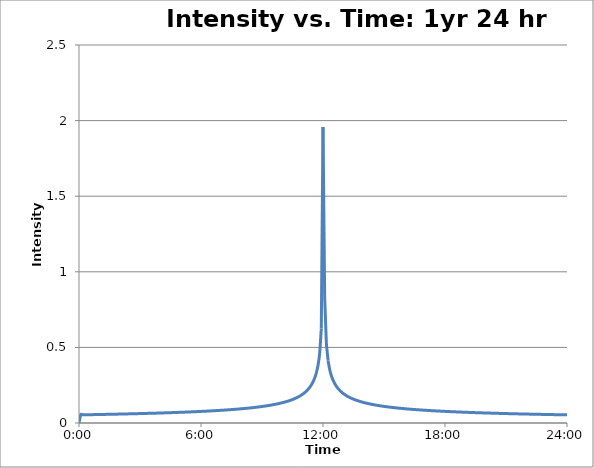
| Category | HCE (CAP) Design Storms |
|---|---|
| 0.0 | 0 |
| 0.003472222222222222 | 0.054 |
| 0.006944444444444444 | 0.054 |
| 0.0104166666666667 | 0.054 |
| 0.0138888888888889 | 0.054 |
| 0.0173611111111111 | 0.055 |
| 0.0208333333333333 | 0.055 |
| 0.0243055555555556 | 0.055 |
| 0.0277777777777778 | 0.055 |
| 0.03125 | 0.056 |
| 0.0347222222222222 | 0.056 |
| 0.0381944444444444 | 0.056 |
| 0.0416666666666667 | 0.056 |
| 0.0451388888888889 | 0.056 |
| 0.0486111111111111 | 0.057 |
| 0.0520833333333333 | 0.057 |
| 0.0555555555555556 | 0.057 |
| 0.0590277777777778 | 0.057 |
| 0.0625 | 0.058 |
| 0.0659722222222222 | 0.058 |
| 0.0694444444444444 | 0.058 |
| 0.0729166666666667 | 0.058 |
| 0.0763888888888889 | 0.058 |
| 0.0798611111111111 | 0.059 |
| 0.0833333333333333 | 0.059 |
| 0.0868055555555556 | 0.059 |
| 0.0902777777777778 | 0.06 |
| 0.09375 | 0.06 |
| 0.0972222222222222 | 0.06 |
| 0.100694444444444 | 0.06 |
| 0.104166666666667 | 0.061 |
| 0.107638888888889 | 0.061 |
| 0.111111111111111 | 0.061 |
| 0.114583333333333 | 0.061 |
| 0.118055555555556 | 0.062 |
| 0.121527777777778 | 0.062 |
| 0.125 | 0.062 |
| 0.128472222222222 | 0.063 |
| 0.131944444444444 | 0.063 |
| 0.135416666666667 | 0.063 |
| 0.138888888888889 | 0.064 |
| 0.142361111111111 | 0.064 |
| 0.145833333333333 | 0.064 |
| 0.149305555555556 | 0.064 |
| 0.152777777777778 | 0.065 |
| 0.15625 | 0.065 |
| 0.159722222222222 | 0.065 |
| 0.163194444444444 | 0.066 |
| 0.166666666666667 | 0.066 |
| 0.170138888888889 | 0.066 |
| 0.173611111111111 | 0.067 |
| 0.177083333333333 | 0.067 |
| 0.180555555555556 | 0.068 |
| 0.184027777777778 | 0.068 |
| 0.1875 | 0.068 |
| 0.190972222222222 | 0.069 |
| 0.194444444444444 | 0.069 |
| 0.197916666666667 | 0.07 |
| 0.201388888888889 | 0.07 |
| 0.204861111111111 | 0.07 |
| 0.208333333333333 | 0.071 |
| 0.211805555555556 | 0.071 |
| 0.215277777777778 | 0.072 |
| 0.21875 | 0.072 |
| 0.222222222222222 | 0.073 |
| 0.225694444444444 | 0.073 |
| 0.229166666666667 | 0.074 |
| 0.232638888888889 | 0.074 |
| 0.236111111111111 | 0.074 |
| 0.239583333333333 | 0.075 |
| 0.243055555555556 | 0.076 |
| 0.246527777777778 | 0.076 |
| 0.25 | 0.077 |
| 0.253472222222222 | 0.077 |
| 0.256944444444444 | 0.078 |
| 0.260416666666667 | 0.078 |
| 0.263888888888889 | 0.079 |
| 0.267361111111111 | 0.08 |
| 0.270833333333333 | 0.08 |
| 0.274305555555556 | 0.081 |
| 0.277777777777778 | 0.081 |
| 0.28125 | 0.082 |
| 0.284722222222222 | 0.083 |
| 0.288194444444444 | 0.083 |
| 0.291666666666667 | 0.084 |
| 0.295138888888889 | 0.085 |
| 0.298611111111111 | 0.086 |
| 0.302083333333333 | 0.086 |
| 0.305555555555556 | 0.087 |
| 0.309027777777778 | 0.088 |
| 0.3125 | 0.089 |
| 0.315972222222222 | 0.09 |
| 0.319444444444444 | 0.09 |
| 0.322916666666667 | 0.091 |
| 0.326388888888889 | 0.092 |
| 0.329861111111111 | 0.093 |
| 0.333333333333333 | 0.094 |
| 0.336805555555556 | 0.095 |
| 0.340277777777778 | 0.096 |
| 0.34375 | 0.097 |
| 0.347222222222222 | 0.098 |
| 0.350694444444444 | 0.1 |
| 0.354166666666667 | 0.101 |
| 0.357638888888889 | 0.102 |
| 0.361111111111111 | 0.103 |
| 0.364583333333333 | 0.105 |
| 0.368055555555556 | 0.106 |
| 0.371527777777778 | 0.108 |
| 0.375 | 0.109 |
| 0.378472222222222 | 0.111 |
| 0.381944444444444 | 0.112 |
| 0.385416666666667 | 0.114 |
| 0.388888888888889 | 0.116 |
| 0.392361111111111 | 0.118 |
| 0.395833333333333 | 0.12 |
| 0.399305555555556 | 0.122 |
| 0.402777777777778 | 0.124 |
| 0.40625 | 0.126 |
| 0.409722222222222 | 0.129 |
| 0.413194444444444 | 0.131 |
| 0.416666666666667 | 0.134 |
| 0.420138888888889 | 0.137 |
| 0.423611111111111 | 0.14 |
| 0.427083333333333 | 0.144 |
| 0.430555555555556 | 0.147 |
| 0.434027777777778 | 0.151 |
| 0.4375 | 0.155 |
| 0.440972222222222 | 0.16 |
| 0.444444444444444 | 0.165 |
| 0.447916666666667 | 0.17 |
| 0.451388888888889 | 0.176 |
| 0.454861111111111 | 0.183 |
| 0.458333333333333 | 0.191 |
| 0.461805555555556 | 0.199 |
| 0.465277777777778 | 0.209 |
| 0.46875 | 0.22 |
| 0.472222222222222 | 0.234 |
| 0.475694444444444 | 0.25 |
| 0.479166666666667 | 0.27 |
| 0.482638888888889 | 0.295 |
| 0.486111111111111 | 0.329 |
| 0.489583333333333 | 0.378 |
| 0.493055555555556 | 0.458 |
| 0.496527777777778 | 0.625 |
| 0.5 | 1.957 |
| 0.503472222222222 | 0.827 |
| 0.506944444444444 | 0.523 |
| 0.510416666666667 | 0.412 |
| 0.513888888888889 | 0.351 |
| 0.517361111111111 | 0.311 |
| 0.520833333333333 | 0.281 |
| 0.524305555555556 | 0.259 |
| 0.527777777777778 | 0.241 |
| 0.53125 | 0.227 |
| 0.534722222222222 | 0.214 |
| 0.538194444444444 | 0.204 |
| 0.541666666666667 | 0.195 |
| 0.545138888888889 | 0.187 |
| 0.548611111111111 | 0.18 |
| 0.552083333333333 | 0.173 |
| 0.555555555555556 | 0.168 |
| 0.559027777777778 | 0.162 |
| 0.5625 | 0.158 |
| 0.565972222222222 | 0.153 |
| 0.569444444444444 | 0.149 |
| 0.572916666666667 | 0.145 |
| 0.576388888888889 | 0.142 |
| 0.579861111111111 | 0.139 |
| 0.583333333333333 | 0.136 |
| 0.586805555555555 | 0.133 |
| 0.590277777777778 | 0.13 |
| 0.59375 | 0.128 |
| 0.597222222222222 | 0.125 |
| 0.600694444444444 | 0.123 |
| 0.604166666666667 | 0.121 |
| 0.607638888888889 | 0.119 |
| 0.611111111111111 | 0.117 |
| 0.614583333333333 | 0.115 |
| 0.618055555555555 | 0.113 |
| 0.621527777777778 | 0.112 |
| 0.625 | 0.11 |
| 0.628472222222222 | 0.108 |
| 0.631944444444444 | 0.107 |
| 0.635416666666667 | 0.106 |
| 0.638888888888889 | 0.104 |
| 0.642361111111111 | 0.103 |
| 0.645833333333333 | 0.102 |
| 0.649305555555555 | 0.1 |
| 0.652777777777778 | 0.099 |
| 0.65625 | 0.098 |
| 0.659722222222222 | 0.097 |
| 0.663194444444444 | 0.096 |
| 0.666666666666667 | 0.095 |
| 0.670138888888889 | 0.094 |
| 0.673611111111111 | 0.093 |
| 0.677083333333333 | 0.092 |
| 0.680555555555555 | 0.091 |
| 0.684027777777778 | 0.09 |
| 0.6875 | 0.089 |
| 0.690972222222222 | 0.088 |
| 0.694444444444444 | 0.088 |
| 0.697916666666667 | 0.087 |
| 0.701388888888889 | 0.086 |
| 0.704861111111111 | 0.085 |
| 0.708333333333333 | 0.084 |
| 0.711805555555555 | 0.084 |
| 0.715277777777778 | 0.083 |
| 0.71875 | 0.082 |
| 0.722222222222222 | 0.082 |
| 0.725694444444444 | 0.081 |
| 0.729166666666667 | 0.08 |
| 0.732638888888889 | 0.08 |
| 0.736111111111111 | 0.079 |
| 0.739583333333333 | 0.079 |
| 0.743055555555555 | 0.078 |
| 0.746527777777778 | 0.077 |
| 0.75 | 0.077 |
| 0.753472222222222 | 0.076 |
| 0.756944444444444 | 0.076 |
| 0.760416666666667 | 0.075 |
| 0.763888888888889 | 0.075 |
| 0.767361111111111 | 0.074 |
| 0.770833333333333 | 0.074 |
| 0.774305555555555 | 0.073 |
| 0.777777777777778 | 0.073 |
| 0.78125 | 0.072 |
| 0.784722222222222 | 0.072 |
| 0.788194444444444 | 0.072 |
| 0.791666666666667 | 0.071 |
| 0.795138888888889 | 0.071 |
| 0.798611111111111 | 0.07 |
| 0.802083333333333 | 0.07 |
| 0.805555555555555 | 0.069 |
| 0.809027777777778 | 0.069 |
| 0.8125 | 0.068 |
| 0.815972222222222 | 0.068 |
| 0.819444444444444 | 0.068 |
| 0.822916666666667 | 0.067 |
| 0.826388888888889 | 0.067 |
| 0.829861111111111 | 0.067 |
| 0.833333333333333 | 0.066 |
| 0.836805555555555 | 0.066 |
| 0.840277777777778 | 0.066 |
| 0.84375 | 0.065 |
| 0.847222222222222 | 0.065 |
| 0.850694444444444 | 0.065 |
| 0.854166666666667 | 0.064 |
| 0.857638888888889 | 0.064 |
| 0.861111111111111 | 0.064 |
| 0.864583333333333 | 0.063 |
| 0.868055555555555 | 0.063 |
| 0.871527777777778 | 0.063 |
| 0.875 | 0.062 |
| 0.878472222222222 | 0.062 |
| 0.881944444444444 | 0.062 |
| 0.885416666666667 | 0.062 |
| 0.888888888888889 | 0.061 |
| 0.892361111111111 | 0.061 |
| 0.895833333333333 | 0.061 |
| 0.899305555555555 | 0.06 |
| 0.902777777777778 | 0.06 |
| 0.90625 | 0.06 |
| 0.909722222222222 | 0.06 |
| 0.913194444444444 | 0.059 |
| 0.916666666666667 | 0.059 |
| 0.920138888888889 | 0.059 |
| 0.923611111111111 | 0.059 |
| 0.927083333333333 | 0.058 |
| 0.930555555555555 | 0.058 |
| 0.934027777777778 | 0.058 |
| 0.9375 | 0.058 |
| 0.940972222222222 | 0.057 |
| 0.944444444444444 | 0.057 |
| 0.947916666666667 | 0.057 |
| 0.951388888888889 | 0.057 |
| 0.954861111111111 | 0.056 |
| 0.958333333333333 | 0.056 |
| 0.961805555555555 | 0.056 |
| 0.965277777777778 | 0.056 |
| 0.96875 | 0.056 |
| 0.972222222222222 | 0.055 |
| 0.975694444444444 | 0.055 |
| 0.979166666666667 | 0.055 |
| 0.982638888888889 | 0.055 |
| 0.986111111111111 | 0.055 |
| 0.989583333333333 | 0.054 |
| 0.993055555555555 | 0.054 |
| 0.996527777777778 | 0.054 |
| 1.0 | 0.054 |